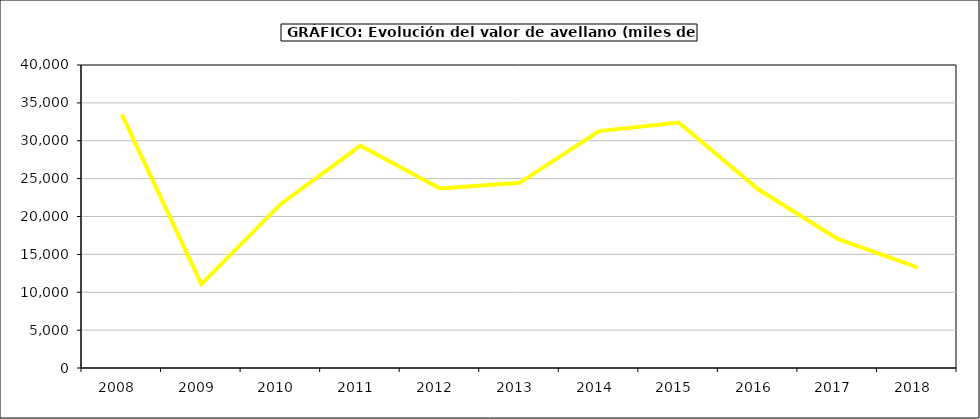
| Category | valor avellano |
|---|---|
| 2008.0 | 33473.214 |
| 2009.0 | 11073.069 |
| 2010.0 | 21658.97 |
| 2011.0 | 29345.397 |
| 2012.0 | 23700.751 |
| 2013.0 | 24448.005 |
| 2014.0 | 31273.096 |
| 2015.0 | 32413 |
| 2016.0 | 23592 |
| 2017.0 | 17033.361 |
| 2018.0 | 13279.352 |